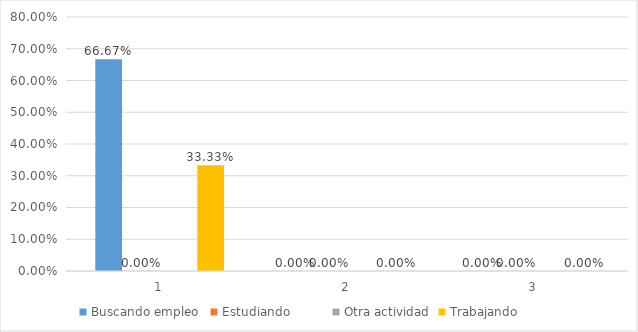
| Category | Buscando empleo  | Estudiando          | Otra actividad | Trabajando          |
|---|---|---|---|---|
| 0 | 0.667 | 0 | 0 | 0.333 |
| 1 | 0 | 0 | 0 | 0 |
| 2 | 0 | 0 | 0 | 0 |